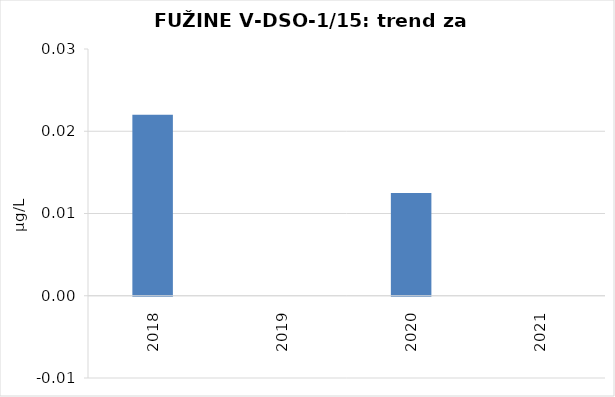
| Category | Vsota |
|---|---|
| 2018 | 0.022 |
| 2019 | 0 |
| 2020 | 0.012 |
| 2021 | 0 |